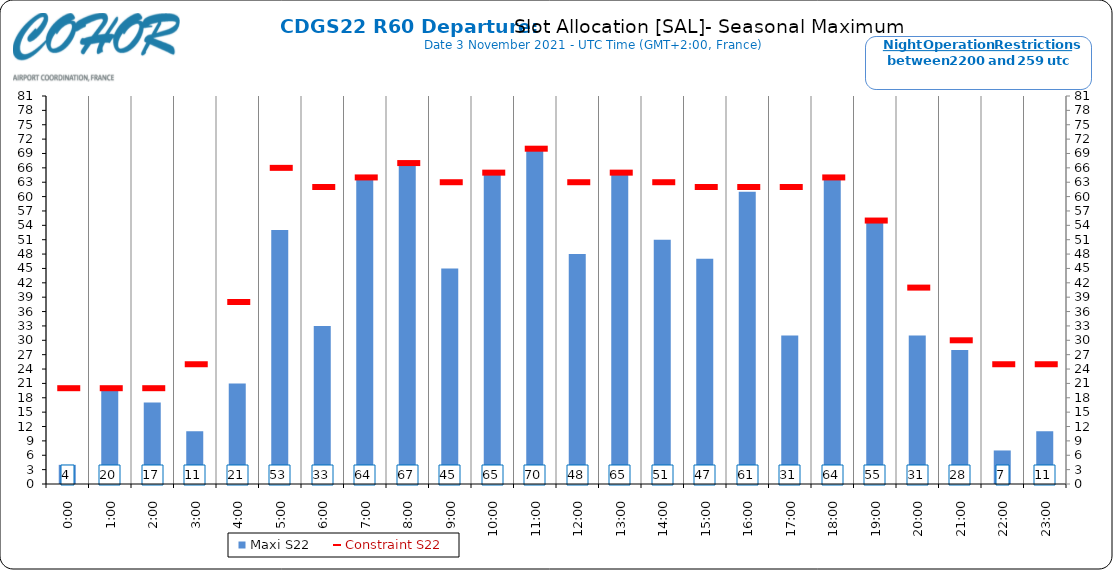
| Category | Maxi S22 |
|---|---|
| 0:00 | 4 |
| 1:00 | 20 |
| 2:00 | 17 |
| 3:00 | 11 |
| 4:00 | 21 |
| 5:00 | 53 |
| 6:00 | 33 |
| 7:00 | 64 |
| 8:00 | 67 |
| 9:00 | 45 |
| 10:00 | 65 |
| 11:00 | 70 |
| 12:00 | 48 |
| 13:00 | 65 |
| 14:00 | 51 |
| 15:00 | 47 |
| 16:00 | 61 |
| 17:00 | 31 |
| 18:00 | 64 |
| 19:00 | 55 |
| 20:00 | 31 |
| 21:00 | 28 |
| 22:00 | 7 |
| 23:00 | 11 |